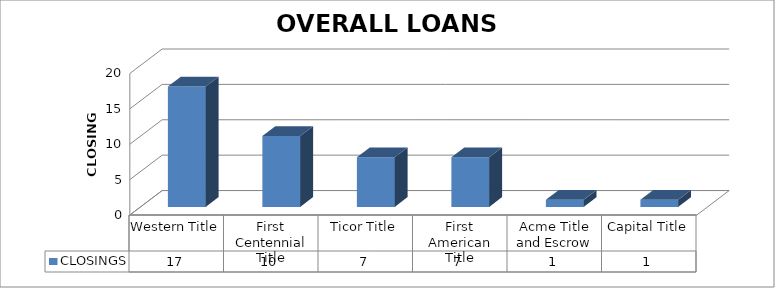
| Category | CLOSINGS |
|---|---|
| Western Title | 17 |
| First Centennial Title | 10 |
| Ticor Title | 7 |
| First American Title | 7 |
| Acme Title and Escrow | 1 |
| Capital Title | 1 |